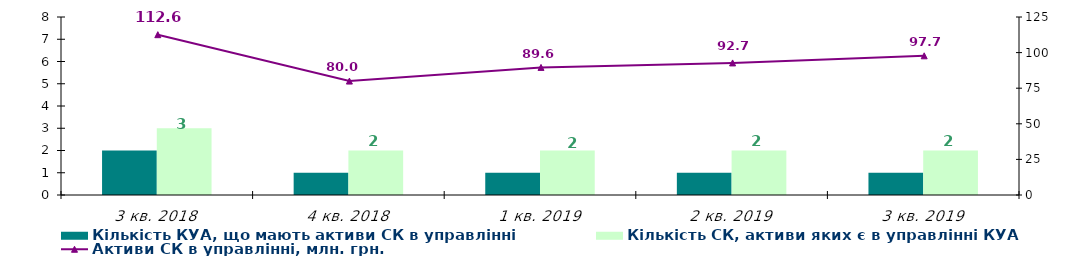
| Category | Кількість КУА, що мають активи СК в управлінні | Кількість СК, активи яких є в управлінні КУА |
|---|---|---|
| 3 кв. 2018 | 2 | 3 |
| 4 кв. 2018 | 1 | 2 |
| 1 кв. 2019 | 1 | 2 |
| 2 кв. 2019 | 1 | 2 |
| 3 кв. 2019 | 1 | 2 |